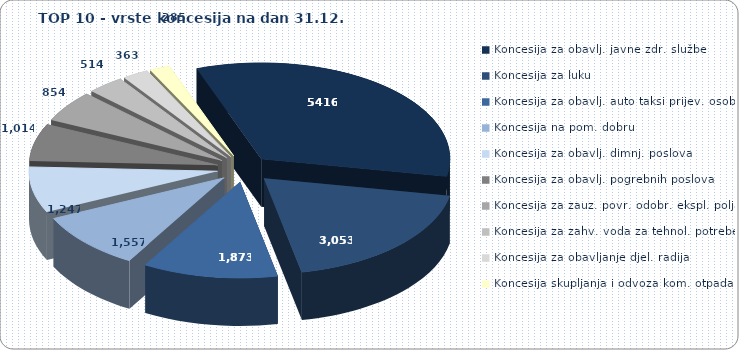
| Category | Series 0 |
|---|---|
| Koncesija za obavlj. javne zdr. službe | 5416 |
| Koncesija za luku | 3053 |
| Koncesija za obavlj. auto taksi prijev. osoba | 1873 |
| Koncesija na pom. dobru | 1557 |
| Koncesija za obavlj. dimnj. poslova | 1247 |
| Koncesija za obavlj. pogrebnih poslova | 1014 |
| Koncesija za zauz. povr. odobr. ekspl. polja | 854 |
| Koncesija za zahv. voda za tehnol. potrebe | 514 |
| Koncesija za obavljanje djel. radija | 363 |
| Koncesija skupljanja i odvoza kom. otpada | 285 |